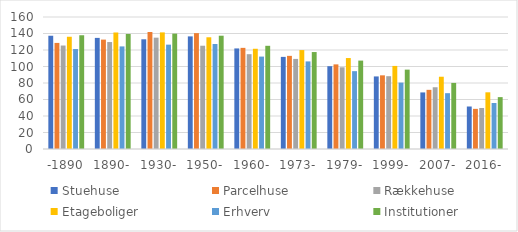
| Category | Stuehuse | Parcelhuse | Rækkehuse | Etageboliger | Erhverv | Institutioner |
|---|---|---|---|---|---|---|
| -1890 | 137.274 | 128.58 | 125.42 | 136.061 | 121.168 | 137.873 |
| 1890- | 134.674 | 132.594 | 129.642 | 141.232 | 124.353 | 139.458 |
| 1930- | 132.975 | 141.816 | 134.956 | 141.355 | 126.488 | 139.842 |
| 1950- | 136.495 | 140.441 | 125.183 | 135.416 | 127.275 | 137.322 |
| 1960- | 121.9 | 122.591 | 114.929 | 121.49 | 112.018 | 125.085 |
| 1973- | 111.658 | 112.894 | 109.199 | 119.903 | 106.168 | 117.515 |
| 1979- | 100.359 | 102.577 | 99.058 | 110.25 | 94.354 | 107.154 |
| 1999- | 87.963 | 89.289 | 88.237 | 100.69 | 80.497 | 96.214 |
| 2007- | 68.579 | 71.719 | 74.842 | 87.602 | 67.657 | 80.097 |
| 2016- | 51.514 | 48.652 | 49.721 | 68.719 | 55.735 | 62.876 |